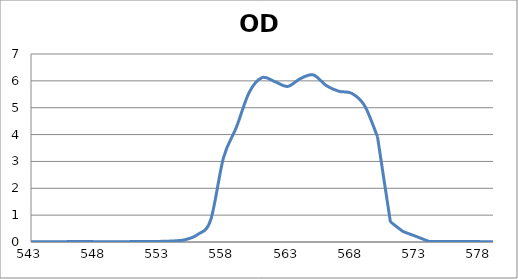
| Category | Series 0 |
|---|---|
| 2600.0 | 0.036 |
| 2599.0 | 0.035 |
| 2598.0 | 0.035 |
| 2597.0 | 0.034 |
| 2596.0 | 0.034 |
| 2595.0 | 0.033 |
| 2594.0 | 0.033 |
| 2593.0 | 0.032 |
| 2592.0 | 0.032 |
| 2591.0 | 0.032 |
| 2590.0 | 0.031 |
| 2589.0 | 0.031 |
| 2588.0 | 0.03 |
| 2587.0 | 0.03 |
| 2586.0 | 0.03 |
| 2585.0 | 0.03 |
| 2584.0 | 0.029 |
| 2583.0 | 0.029 |
| 2582.0 | 0.029 |
| 2581.0 | 0.029 |
| 2580.0 | 0.029 |
| 2579.0 | 0.028 |
| 2578.0 | 0.028 |
| 2577.0 | 0.028 |
| 2576.0 | 0.028 |
| 2575.0 | 0.028 |
| 2574.0 | 0.028 |
| 2573.0 | 0.028 |
| 2572.0 | 0.028 |
| 2571.0 | 0.028 |
| 2570.0 | 0.028 |
| 2569.0 | 0.028 |
| 2568.0 | 0.028 |
| 2567.0 | 0.028 |
| 2566.0 | 0.028 |
| 2565.0 | 0.028 |
| 2564.0 | 0.029 |
| 2563.0 | 0.029 |
| 2562.0 | 0.029 |
| 2561.0 | 0.029 |
| 2560.0 | 0.03 |
| 2559.0 | 0.03 |
| 2558.0 | 0.03 |
| 2557.0 | 0.031 |
| 2556.0 | 0.031 |
| 2555.0 | 0.032 |
| 2554.0 | 0.032 |
| 2553.0 | 0.033 |
| 2552.0 | 0.034 |
| 2551.0 | 0.034 |
| 2550.0 | 0.035 |
| 2549.0 | 0.036 |
| 2548.0 | 0.037 |
| 2547.0 | 0.038 |
| 2546.0 | 0.039 |
| 2545.0 | 0.04 |
| 2544.0 | 0.04 |
| 2543.0 | 0.041 |
| 2542.0 | 0.042 |
| 2541.0 | 0.042 |
| 2540.0 | 0.043 |
| 2539.0 | 0.044 |
| 2538.0 | 0.044 |
| 2537.0 | 0.045 |
| 2536.0 | 0.045 |
| 2535.0 | 0.046 |
| 2534.0 | 0.046 |
| 2533.0 | 0.046 |
| 2532.0 | 0.046 |
| 2531.0 | 0.046 |
| 2530.0 | 0.046 |
| 2529.0 | 0.046 |
| 2528.0 | 0.046 |
| 2527.0 | 0.046 |
| 2526.0 | 0.046 |
| 2525.0 | 0.045 |
| 2524.0 | 0.045 |
| 2523.0 | 0.044 |
| 2522.0 | 0.043 |
| 2521.0 | 0.043 |
| 2520.0 | 0.042 |
| 2519.0 | 0.041 |
| 2518.0 | 0.041 |
| 2517.0 | 0.04 |
| 2516.0 | 0.039 |
| 2515.0 | 0.038 |
| 2514.0 | 0.038 |
| 2513.0 | 0.037 |
| 2512.0 | 0.037 |
| 2511.0 | 0.036 |
| 2510.0 | 0.036 |
| 2509.0 | 0.036 |
| 2508.0 | 0.036 |
| 2507.0 | 0.036 |
| 2506.0 | 0.037 |
| 2505.0 | 0.037 |
| 2504.0 | 0.038 |
| 2503.0 | 0.039 |
| 2502.0 | 0.04 |
| 2501.0 | 0.041 |
| 2500.0 | 0.043 |
| 2499.0 | 0.045 |
| 2498.0 | 0.046 |
| 2497.0 | 0.048 |
| 2496.0 | 0.05 |
| 2495.0 | 0.052 |
| 2494.0 | 0.054 |
| 2493.0 | 0.057 |
| 2492.0 | 0.059 |
| 2491.0 | 0.062 |
| 2490.0 | 0.064 |
| 2489.0 | 0.066 |
| 2488.0 | 0.069 |
| 2487.0 | 0.071 |
| 2486.0 | 0.073 |
| 2485.0 | 0.076 |
| 2484.0 | 0.078 |
| 2483.0 | 0.079 |
| 2482.0 | 0.081 |
| 2481.0 | 0.083 |
| 2480.0 | 0.084 |
| 2479.0 | 0.085 |
| 2478.0 | 0.086 |
| 2477.0 | 0.087 |
| 2476.0 | 0.087 |
| 2475.0 | 0.087 |
| 2474.0 | 0.087 |
| 2473.0 | 0.087 |
| 2472.0 | 0.086 |
| 2471.0 | 0.085 |
| 2470.0 | 0.084 |
| 2469.0 | 0.083 |
| 2468.0 | 0.081 |
| 2467.0 | 0.08 |
| 2466.0 | 0.078 |
| 2465.0 | 0.075 |
| 2464.0 | 0.073 |
| 2463.0 | 0.071 |
| 2462.0 | 0.068 |
| 2461.0 | 0.066 |
| 2460.0 | 0.063 |
| 2459.0 | 0.061 |
| 2458.0 | 0.058 |
| 2457.0 | 0.056 |
| 2456.0 | 0.054 |
| 2455.0 | 0.052 |
| 2454.0 | 0.05 |
| 2453.0 | 0.048 |
| 2452.0 | 0.047 |
| 2451.0 | 0.045 |
| 2450.0 | 0.044 |
| 2449.0 | 0.044 |
| 2448.0 | 0.043 |
| 2447.0 | 0.043 |
| 2446.0 | 0.043 |
| 2445.0 | 0.043 |
| 2444.0 | 0.044 |
| 2443.0 | 0.045 |
| 2442.0 | 0.046 |
| 2441.0 | 0.047 |
| 2440.0 | 0.049 |
| 2439.0 | 0.051 |
| 2438.0 | 0.053 |
| 2437.0 | 0.055 |
| 2436.0 | 0.057 |
| 2435.0 | 0.059 |
| 2434.0 | 0.061 |
| 2433.0 | 0.063 |
| 2432.0 | 0.066 |
| 2431.0 | 0.068 |
| 2430.0 | 0.069 |
| 2429.0 | 0.071 |
| 2428.0 | 0.073 |
| 2427.0 | 0.074 |
| 2426.0 | 0.075 |
| 2425.0 | 0.076 |
| 2424.0 | 0.077 |
| 2423.0 | 0.077 |
| 2422.0 | 0.077 |
| 2421.0 | 0.077 |
| 2420.0 | 0.077 |
| 2419.0 | 0.076 |
| 2418.0 | 0.075 |
| 2417.0 | 0.074 |
| 2416.0 | 0.073 |
| 2415.0 | 0.071 |
| 2414.0 | 0.069 |
| 2413.0 | 0.068 |
| 2412.0 | 0.066 |
| 2411.0 | 0.064 |
| 2410.0 | 0.062 |
| 2409.0 | 0.06 |
| 2408.0 | 0.058 |
| 2407.0 | 0.056 |
| 2406.0 | 0.054 |
| 2405.0 | 0.053 |
| 2404.0 | 0.051 |
| 2403.0 | 0.05 |
| 2402.0 | 0.049 |
| 2401.0 | 0.048 |
| 2400.0 | 0.048 |
| 2399.0 | 0.048 |
| 2398.0 | 0.048 |
| 2397.0 | 0.048 |
| 2396.0 | 0.049 |
| 2395.0 | 0.05 |
| 2394.0 | 0.052 |
| 2393.0 | 0.053 |
| 2392.0 | 0.055 |
| 2391.0 | 0.057 |
| 2390.0 | 0.06 |
| 2389.0 | 0.063 |
| 2388.0 | 0.066 |
| 2387.0 | 0.068 |
| 2386.0 | 0.071 |
| 2385.0 | 0.074 |
| 2384.0 | 0.077 |
| 2383.0 | 0.079 |
| 2382.0 | 0.082 |
| 2381.0 | 0.084 |
| 2380.0 | 0.086 |
| 2379.0 | 0.088 |
| 2378.0 | 0.09 |
| 2377.0 | 0.091 |
| 2376.0 | 0.092 |
| 2375.0 | 0.093 |
| 2374.0 | 0.094 |
| 2373.0 | 0.094 |
| 2372.0 | 0.093 |
| 2371.0 | 0.093 |
| 2370.0 | 0.092 |
| 2369.0 | 0.091 |
| 2368.0 | 0.09 |
| 2367.0 | 0.088 |
| 2366.0 | 0.086 |
| 2365.0 | 0.084 |
| 2364.0 | 0.082 |
| 2363.0 | 0.08 |
| 2362.0 | 0.077 |
| 2361.0 | 0.075 |
| 2360.0 | 0.073 |
| 2359.0 | 0.07 |
| 2358.0 | 0.069 |
| 2357.0 | 0.067 |
| 2356.0 | 0.065 |
| 2355.0 | 0.063 |
| 2354.0 | 0.062 |
| 2353.0 | 0.062 |
| 2352.0 | 0.061 |
| 2351.0 | 0.062 |
| 2350.0 | 0.063 |
| 2349.0 | 0.064 |
| 2348.0 | 0.065 |
| 2347.0 | 0.067 |
| 2346.0 | 0.069 |
| 2345.0 | 0.071 |
| 2344.0 | 0.074 |
| 2343.0 | 0.077 |
| 2342.0 | 0.081 |
| 2341.0 | 0.084 |
| 2340.0 | 0.088 |
| 2339.0 | 0.091 |
| 2338.0 | 0.095 |
| 2337.0 | 0.098 |
| 2336.0 | 0.102 |
| 2335.0 | 0.105 |
| 2334.0 | 0.108 |
| 2333.0 | 0.111 |
| 2332.0 | 0.113 |
| 2331.0 | 0.115 |
| 2330.0 | 0.117 |
| 2329.0 | 0.118 |
| 2328.0 | 0.119 |
| 2327.0 | 0.12 |
| 2326.0 | 0.12 |
| 2325.0 | 0.12 |
| 2324.0 | 0.119 |
| 2323.0 | 0.118 |
| 2322.0 | 0.117 |
| 2321.0 | 0.116 |
| 2320.0 | 0.114 |
| 2319.0 | 0.111 |
| 2318.0 | 0.109 |
| 2317.0 | 0.106 |
| 2316.0 | 0.103 |
| 2315.0 | 0.101 |
| 2314.0 | 0.098 |
| 2313.0 | 0.095 |
| 2312.0 | 0.093 |
| 2311.0 | 0.091 |
| 2310.0 | 0.089 |
| 2309.0 | 0.088 |
| 2308.0 | 0.087 |
| 2307.0 | 0.086 |
| 2306.0 | 0.086 |
| 2305.0 | 0.087 |
| 2304.0 | 0.088 |
| 2303.0 | 0.09 |
| 2302.0 | 0.092 |
| 2301.0 | 0.095 |
| 2300.0 | 0.098 |
| 2299.0 | 0.101 |
| 2298.0 | 0.105 |
| 2297.0 | 0.109 |
| 2296.0 | 0.114 |
| 2295.0 | 0.118 |
| 2294.0 | 0.123 |
| 2293.0 | 0.127 |
| 2292.0 | 0.132 |
| 2291.0 | 0.136 |
| 2290.0 | 0.14 |
| 2289.0 | 0.144 |
| 2288.0 | 0.147 |
| 2287.0 | 0.151 |
| 2286.0 | 0.153 |
| 2285.0 | 0.155 |
| 2284.0 | 0.157 |
| 2283.0 | 0.158 |
| 2282.0 | 0.158 |
| 2281.0 | 0.158 |
| 2280.0 | 0.157 |
| 2279.0 | 0.155 |
| 2278.0 | 0.153 |
| 2277.0 | 0.15 |
| 2276.0 | 0.146 |
| 2275.0 | 0.141 |
| 2274.0 | 0.136 |
| 2273.0 | 0.131 |
| 2272.0 | 0.125 |
| 2271.0 | 0.119 |
| 2270.0 | 0.112 |
| 2269.0 | 0.106 |
| 2268.0 | 0.099 |
| 2267.0 | 0.093 |
| 2266.0 | 0.087 |
| 2265.0 | 0.08 |
| 2264.0 | 0.075 |
| 2263.0 | 0.07 |
| 2262.0 | 0.065 |
| 2261.0 | 0.062 |
| 2260.0 | 0.059 |
| 2259.0 | 0.057 |
| 2258.0 | 0.056 |
| 2257.0 | 0.056 |
| 2256.0 | 0.057 |
| 2255.0 | 0.058 |
| 2254.0 | 0.061 |
| 2253.0 | 0.064 |
| 2252.0 | 0.068 |
| 2251.0 | 0.073 |
| 2250.0 | 0.078 |
| 2249.0 | 0.083 |
| 2248.0 | 0.089 |
| 2247.0 | 0.095 |
| 2246.0 | 0.101 |
| 2245.0 | 0.107 |
| 2244.0 | 0.112 |
| 2243.0 | 0.118 |
| 2242.0 | 0.124 |
| 2241.0 | 0.128 |
| 2240.0 | 0.133 |
| 2239.0 | 0.137 |
| 2238.0 | 0.14 |
| 2237.0 | 0.143 |
| 2236.0 | 0.144 |
| 2235.0 | 0.145 |
| 2234.0 | 0.146 |
| 2233.0 | 0.145 |
| 2232.0 | 0.144 |
| 2231.0 | 0.142 |
| 2230.0 | 0.14 |
| 2229.0 | 0.137 |
| 2228.0 | 0.134 |
| 2227.0 | 0.13 |
| 2226.0 | 0.125 |
| 2225.0 | 0.121 |
| 2224.0 | 0.116 |
| 2223.0 | 0.111 |
| 2222.0 | 0.107 |
| 2221.0 | 0.102 |
| 2220.0 | 0.098 |
| 2219.0 | 0.094 |
| 2218.0 | 0.091 |
| 2217.0 | 0.088 |
| 2216.0 | 0.086 |
| 2215.0 | 0.084 |
| 2214.0 | 0.083 |
| 2213.0 | 0.083 |
| 2212.0 | 0.083 |
| 2211.0 | 0.084 |
| 2210.0 | 0.086 |
| 2209.0 | 0.088 |
| 2208.0 | 0.091 |
| 2207.0 | 0.094 |
| 2206.0 | 0.098 |
| 2205.0 | 0.102 |
| 2204.0 | 0.105 |
| 2203.0 | 0.109 |
| 2202.0 | 0.113 |
| 2201.0 | 0.117 |
| 2200.0 | 0.121 |
| 2199.0 | 0.124 |
| 2198.0 | 0.127 |
| 2197.0 | 0.129 |
| 2196.0 | 0.13 |
| 2195.0 | 0.131 |
| 2194.0 | 0.132 |
| 2193.0 | 0.131 |
| 2192.0 | 0.13 |
| 2191.0 | 0.129 |
| 2190.0 | 0.126 |
| 2189.0 | 0.124 |
| 2188.0 | 0.12 |
| 2187.0 | 0.116 |
| 2186.0 | 0.111 |
| 2185.0 | 0.107 |
| 2184.0 | 0.102 |
| 2183.0 | 0.097 |
| 2182.0 | 0.092 |
| 2181.0 | 0.087 |
| 2180.0 | 0.082 |
| 2179.0 | 0.078 |
| 2178.0 | 0.074 |
| 2177.0 | 0.071 |
| 2176.0 | 0.069 |
| 2175.0 | 0.067 |
| 2174.0 | 0.066 |
| 2173.0 | 0.066 |
| 2172.0 | 0.067 |
| 2171.0 | 0.068 |
| 2170.0 | 0.07 |
| 2169.0 | 0.073 |
| 2168.0 | 0.077 |
| 2167.0 | 0.081 |
| 2166.0 | 0.085 |
| 2165.0 | 0.09 |
| 2164.0 | 0.095 |
| 2163.0 | 0.101 |
| 2162.0 | 0.106 |
| 2161.0 | 0.111 |
| 2160.0 | 0.115 |
| 2159.0 | 0.12 |
| 2158.0 | 0.124 |
| 2157.0 | 0.127 |
| 2156.0 | 0.129 |
| 2155.0 | 0.131 |
| 2154.0 | 0.132 |
| 2153.0 | 0.132 |
| 2152.0 | 0.131 |
| 2151.0 | 0.129 |
| 2150.0 | 0.126 |
| 2149.0 | 0.123 |
| 2148.0 | 0.119 |
| 2147.0 | 0.114 |
| 2146.0 | 0.109 |
| 2145.0 | 0.103 |
| 2144.0 | 0.097 |
| 2143.0 | 0.091 |
| 2142.0 | 0.085 |
| 2141.0 | 0.079 |
| 2140.0 | 0.074 |
| 2139.0 | 0.069 |
| 2138.0 | 0.065 |
| 2137.0 | 0.061 |
| 2136.0 | 0.059 |
| 2135.0 | 0.057 |
| 2134.0 | 0.057 |
| 2133.0 | 0.058 |
| 2132.0 | 0.06 |
| 2131.0 | 0.064 |
| 2130.0 | 0.068 |
| 2129.0 | 0.074 |
| 2128.0 | 0.081 |
| 2127.0 | 0.088 |
| 2126.0 | 0.096 |
| 2125.0 | 0.105 |
| 2124.0 | 0.114 |
| 2123.0 | 0.123 |
| 2122.0 | 0.133 |
| 2121.0 | 0.142 |
| 2120.0 | 0.151 |
| 2119.0 | 0.159 |
| 2118.0 | 0.167 |
| 2117.0 | 0.174 |
| 2116.0 | 0.181 |
| 2115.0 | 0.186 |
| 2114.0 | 0.191 |
| 2113.0 | 0.195 |
| 2112.0 | 0.198 |
| 2111.0 | 0.2 |
| 2110.0 | 0.201 |
| 2109.0 | 0.2 |
| 2108.0 | 0.2 |
| 2107.0 | 0.198 |
| 2106.0 | 0.196 |
| 2105.0 | 0.193 |
| 2104.0 | 0.19 |
| 2103.0 | 0.187 |
| 2102.0 | 0.184 |
| 2101.0 | 0.18 |
| 2100.0 | 0.176 |
| 2099.0 | 0.173 |
| 2098.0 | 0.17 |
| 2097.0 | 0.167 |
| 2096.0 | 0.165 |
| 2095.0 | 0.164 |
| 2094.0 | 0.163 |
| 2093.0 | 0.163 |
| 2092.0 | 0.164 |
| 2091.0 | 0.165 |
| 2090.0 | 0.167 |
| 2089.0 | 0.169 |
| 2088.0 | 0.173 |
| 2087.0 | 0.176 |
| 2086.0 | 0.18 |
| 2085.0 | 0.184 |
| 2084.0 | 0.188 |
| 2083.0 | 0.192 |
| 2082.0 | 0.196 |
| 2081.0 | 0.2 |
| 2080.0 | 0.203 |
| 2079.0 | 0.206 |
| 2078.0 | 0.208 |
| 2077.0 | 0.21 |
| 2076.0 | 0.211 |
| 2075.0 | 0.21 |
| 2074.0 | 0.209 |
| 2073.0 | 0.207 |
| 2072.0 | 0.205 |
| 2071.0 | 0.201 |
| 2070.0 | 0.197 |
| 2069.0 | 0.191 |
| 2068.0 | 0.186 |
| 2067.0 | 0.18 |
| 2066.0 | 0.173 |
| 2065.0 | 0.165 |
| 2064.0 | 0.158 |
| 2063.0 | 0.151 |
| 2062.0 | 0.144 |
| 2061.0 | 0.137 |
| 2060.0 | 0.13 |
| 2059.0 | 0.124 |
| 2058.0 | 0.119 |
| 2057.0 | 0.115 |
| 2056.0 | 0.111 |
| 2055.0 | 0.109 |
| 2054.0 | 0.108 |
| 2053.0 | 0.107 |
| 2052.0 | 0.108 |
| 2051.0 | 0.109 |
| 2050.0 | 0.111 |
| 2049.0 | 0.114 |
| 2048.0 | 0.118 |
| 2047.0 | 0.122 |
| 2046.0 | 0.126 |
| 2045.0 | 0.131 |
| 2044.0 | 0.136 |
| 2043.0 | 0.14 |
| 2042.0 | 0.145 |
| 2041.0 | 0.149 |
| 2040.0 | 0.153 |
| 2039.0 | 0.156 |
| 2038.0 | 0.159 |
| 2037.0 | 0.161 |
| 2036.0 | 0.162 |
| 2035.0 | 0.163 |
| 2034.0 | 0.163 |
| 2033.0 | 0.162 |
| 2032.0 | 0.16 |
| 2031.0 | 0.158 |
| 2030.0 | 0.155 |
| 2029.0 | 0.151 |
| 2028.0 | 0.147 |
| 2027.0 | 0.143 |
| 2026.0 | 0.138 |
| 2025.0 | 0.133 |
| 2024.0 | 0.128 |
| 2023.0 | 0.122 |
| 2022.0 | 0.117 |
| 2021.0 | 0.111 |
| 2020.0 | 0.106 |
| 2019.0 | 0.101 |
| 2018.0 | 0.096 |
| 2017.0 | 0.091 |
| 2016.0 | 0.086 |
| 2015.0 | 0.081 |
| 2014.0 | 0.077 |
| 2013.0 | 0.072 |
| 2012.0 | 0.068 |
| 2011.0 | 0.064 |
| 2010.0 | 0.06 |
| 2009.0 | 0.056 |
| 2008.0 | 0.052 |
| 2007.0 | 0.048 |
| 2006.0 | 0.044 |
| 2005.0 | 0.041 |
| 2004.0 | 0.038 |
| 2003.0 | 0.035 |
| 2002.0 | 0.032 |
| 2001.0 | 0.03 |
| 2000.0 | 0.028 |
| 1999.0 | 0.027 |
| 1998.0 | 0.027 |
| 1997.0 | 0.028 |
| 1996.0 | 0.029 |
| 1995.0 | 0.032 |
| 1994.0 | 0.035 |
| 1993.0 | 0.04 |
| 1992.0 | 0.045 |
| 1991.0 | 0.052 |
| 1990.0 | 0.059 |
| 1989.0 | 0.067 |
| 1988.0 | 0.076 |
| 1987.0 | 0.085 |
| 1986.0 | 0.094 |
| 1985.0 | 0.103 |
| 1984.0 | 0.113 |
| 1983.0 | 0.122 |
| 1982.0 | 0.13 |
| 1981.0 | 0.138 |
| 1980.0 | 0.145 |
| 1979.0 | 0.151 |
| 1978.0 | 0.156 |
| 1977.0 | 0.16 |
| 1976.0 | 0.163 |
| 1975.0 | 0.165 |
| 1974.0 | 0.165 |
| 1973.0 | 0.165 |
| 1972.0 | 0.163 |
| 1971.0 | 0.159 |
| 1970.0 | 0.155 |
| 1969.0 | 0.149 |
| 1968.0 | 0.142 |
| 1967.0 | 0.134 |
| 1966.0 | 0.125 |
| 1965.0 | 0.116 |
| 1964.0 | 0.107 |
| 1963.0 | 0.096 |
| 1962.0 | 0.086 |
| 1961.0 | 0.076 |
| 1960.0 | 0.066 |
| 1959.0 | 0.057 |
| 1958.0 | 0.049 |
| 1957.0 | 0.043 |
| 1956.0 | 0.038 |
| 1955.0 | 0.035 |
| 1954.0 | 0.034 |
| 1953.0 | 0.034 |
| 1952.0 | 0.036 |
| 1951.0 | 0.039 |
| 1950.0 | 0.044 |
| 1949.0 | 0.05 |
| 1948.0 | 0.056 |
| 1947.0 | 0.063 |
| 1946.0 | 0.071 |
| 1945.0 | 0.078 |
| 1944.0 | 0.085 |
| 1943.0 | 0.092 |
| 1942.0 | 0.098 |
| 1941.0 | 0.103 |
| 1940.0 | 0.107 |
| 1939.0 | 0.11 |
| 1938.0 | 0.112 |
| 1937.0 | 0.114 |
| 1936.0 | 0.114 |
| 1935.0 | 0.113 |
| 1934.0 | 0.111 |
| 1933.0 | 0.108 |
| 1932.0 | 0.105 |
| 1931.0 | 0.101 |
| 1930.0 | 0.096 |
| 1929.0 | 0.091 |
| 1928.0 | 0.086 |
| 1927.0 | 0.081 |
| 1926.0 | 0.076 |
| 1925.0 | 0.071 |
| 1924.0 | 0.067 |
| 1923.0 | 0.063 |
| 1922.0 | 0.06 |
| 1921.0 | 0.058 |
| 1920.0 | 0.056 |
| 1919.0 | 0.055 |
| 1918.0 | 0.055 |
| 1917.0 | 0.055 |
| 1916.0 | 0.055 |
| 1915.0 | 0.057 |
| 1914.0 | 0.058 |
| 1913.0 | 0.061 |
| 1912.0 | 0.062 |
| 1911.0 | 0.064 |
| 1910.0 | 0.065 |
| 1909.0 | 0.066 |
| 1908.0 | 0.067 |
| 1907.0 | 0.067 |
| 1906.0 | 0.068 |
| 1905.0 | 0.068 |
| 1904.0 | 0.068 |
| 1903.0 | 0.067 |
| 1902.0 | 0.067 |
| 1901.0 | 0.066 |
| 1900.0 | 0.066 |
| 1899.0 | 0.066 |
| 1898.0 | 0.066 |
| 1897.0 | 0.066 |
| 1896.0 | 0.067 |
| 1895.0 | 0.069 |
| 1894.0 | 0.071 |
| 1893.0 | 0.074 |
| 1892.0 | 0.077 |
| 1891.0 | 0.081 |
| 1890.0 | 0.086 |
| 1889.0 | 0.09 |
| 1888.0 | 0.094 |
| 1887.0 | 0.099 |
| 1886.0 | 0.103 |
| 1885.0 | 0.107 |
| 1884.0 | 0.111 |
| 1883.0 | 0.114 |
| 1882.0 | 0.117 |
| 1881.0 | 0.119 |
| 1880.0 | 0.12 |
| 1879.0 | 0.12 |
| 1878.0 | 0.119 |
| 1877.0 | 0.117 |
| 1876.0 | 0.115 |
| 1875.0 | 0.112 |
| 1874.0 | 0.109 |
| 1873.0 | 0.104 |
| 1872.0 | 0.1 |
| 1871.0 | 0.096 |
| 1870.0 | 0.092 |
| 1869.0 | 0.089 |
| 1868.0 | 0.086 |
| 1867.0 | 0.085 |
| 1866.0 | 0.084 |
| 1865.0 | 0.084 |
| 1864.0 | 0.086 |
| 1863.0 | 0.089 |
| 1862.0 | 0.092 |
| 1861.0 | 0.098 |
| 1860.0 | 0.105 |
| 1859.0 | 0.112 |
| 1858.0 | 0.119 |
| 1857.0 | 0.125 |
| 1856.0 | 0.131 |
| 1855.0 | 0.138 |
| 1854.0 | 0.144 |
| 1853.0 | 0.149 |
| 1852.0 | 0.154 |
| 1851.0 | 0.156 |
| 1850.0 | 0.158 |
| 1849.0 | 0.158 |
| 1848.0 | 0.157 |
| 1847.0 | 0.155 |
| 1846.0 | 0.152 |
| 1845.0 | 0.149 |
| 1844.0 | 0.143 |
| 1843.0 | 0.136 |
| 1842.0 | 0.126 |
| 1841.0 | 0.118 |
| 1840.0 | 0.109 |
| 1839.0 | 0.101 |
| 1838.0 | 0.093 |
| 1837.0 | 0.084 |
| 1836.0 | 0.076 |
| 1835.0 | 0.07 |
| 1834.0 | 0.065 |
| 1833.0 | 0.062 |
| 1832.0 | 0.06 |
| 1831.0 | 0.06 |
| 1830.0 | 0.061 |
| 1829.0 | 0.063 |
| 1828.0 | 0.066 |
| 1827.0 | 0.071 |
| 1826.0 | 0.076 |
| 1825.0 | 0.08 |
| 1824.0 | 0.084 |
| 1823.0 | 0.087 |
| 1822.0 | 0.091 |
| 1821.0 | 0.094 |
| 1820.0 | 0.097 |
| 1819.0 | 0.098 |
| 1818.0 | 0.098 |
| 1817.0 | 0.097 |
| 1816.0 | 0.094 |
| 1815.0 | 0.092 |
| 1814.0 | 0.088 |
| 1813.0 | 0.085 |
| 1812.0 | 0.081 |
| 1811.0 | 0.076 |
| 1810.0 | 0.072 |
| 1809.0 | 0.069 |
| 1808.0 | 0.066 |
| 1807.0 | 0.064 |
| 1806.0 | 0.063 |
| 1805.0 | 0.063 |
| 1804.0 | 0.063 |
| 1803.0 | 0.065 |
| 1802.0 | 0.068 |
| 1801.0 | 0.072 |
| 1800.0 | 0.077 |
| 1799.0 | 0.082 |
| 1798.0 | 0.088 |
| 1797.0 | 0.093 |
| 1796.0 | 0.098 |
| 1795.0 | 0.103 |
| 1794.0 | 0.107 |
| 1793.0 | 0.111 |
| 1792.0 | 0.113 |
| 1791.0 | 0.114 |
| 1790.0 | 0.115 |
| 1789.0 | 0.115 |
| 1788.0 | 0.114 |
| 1787.0 | 0.112 |
| 1786.0 | 0.11 |
| 1785.0 | 0.107 |
| 1784.0 | 0.105 |
| 1783.0 | 0.103 |
| 1782.0 | 0.101 |
| 1781.0 | 0.099 |
| 1780.0 | 0.098 |
| 1779.0 | 0.098 |
| 1778.0 | 0.099 |
| 1777.0 | 0.101 |
| 1776.0 | 0.103 |
| 1775.0 | 0.106 |
| 1774.0 | 0.11 |
| 1773.0 | 0.113 |
| 1772.0 | 0.117 |
| 1771.0 | 0.121 |
| 1770.0 | 0.124 |
| 1769.0 | 0.128 |
| 1768.0 | 0.13 |
| 1767.0 | 0.132 |
| 1766.0 | 0.134 |
| 1765.0 | 0.134 |
| 1764.0 | 0.133 |
| 1763.0 | 0.131 |
| 1762.0 | 0.129 |
| 1761.0 | 0.126 |
| 1760.0 | 0.123 |
| 1759.0 | 0.119 |
| 1758.0 | 0.115 |
| 1757.0 | 0.111 |
| 1756.0 | 0.108 |
| 1755.0 | 0.105 |
| 1754.0 | 0.103 |
| 1753.0 | 0.102 |
| 1752.0 | 0.102 |
| 1751.0 | 0.103 |
| 1750.0 | 0.105 |
| 1749.0 | 0.107 |
| 1748.0 | 0.11 |
| 1747.0 | 0.114 |
| 1746.0 | 0.117 |
| 1745.0 | 0.121 |
| 1744.0 | 0.124 |
| 1743.0 | 0.126 |
| 1742.0 | 0.128 |
| 1741.0 | 0.129 |
| 1740.0 | 0.129 |
| 1739.0 | 0.128 |
| 1738.0 | 0.125 |
| 1737.0 | 0.122 |
| 1736.0 | 0.119 |
| 1735.0 | 0.114 |
| 1734.0 | 0.109 |
| 1733.0 | 0.104 |
| 1732.0 | 0.099 |
| 1731.0 | 0.094 |
| 1730.0 | 0.09 |
| 1729.0 | 0.086 |
| 1728.0 | 0.084 |
| 1727.0 | 0.083 |
| 1726.0 | 0.083 |
| 1725.0 | 0.084 |
| 1724.0 | 0.086 |
| 1723.0 | 0.089 |
| 1722.0 | 0.093 |
| 1721.0 | 0.098 |
| 1720.0 | 0.103 |
| 1719.0 | 0.108 |
| 1718.0 | 0.113 |
| 1717.0 | 0.117 |
| 1716.0 | 0.12 |
| 1715.0 | 0.123 |
| 1714.0 | 0.124 |
| 1713.0 | 0.124 |
| 1712.0 | 0.123 |
| 1711.0 | 0.122 |
| 1710.0 | 0.119 |
| 1709.0 | 0.116 |
| 1708.0 | 0.113 |
| 1707.0 | 0.109 |
| 1706.0 | 0.106 |
| 1705.0 | 0.103 |
| 1704.0 | 0.1 |
| 1703.0 | 0.099 |
| 1702.0 | 0.098 |
| 1701.0 | 0.099 |
| 1700.0 | 0.1 |
| 1699.0 | 0.103 |
| 1698.0 | 0.105 |
| 1697.0 | 0.109 |
| 1696.0 | 0.113 |
| 1695.0 | 0.116 |
| 1694.0 | 0.12 |
| 1693.0 | 0.123 |
| 1692.0 | 0.126 |
| 1691.0 | 0.128 |
| 1690.0 | 0.129 |
| 1689.0 | 0.13 |
| 1688.0 | 0.129 |
| 1687.0 | 0.128 |
| 1686.0 | 0.126 |
| 1685.0 | 0.124 |
| 1684.0 | 0.122 |
| 1683.0 | 0.12 |
| 1682.0 | 0.118 |
| 1681.0 | 0.116 |
| 1680.0 | 0.115 |
| 1679.0 | 0.115 |
| 1678.0 | 0.116 |
| 1677.0 | 0.118 |
| 1676.0 | 0.121 |
| 1675.0 | 0.125 |
| 1674.0 | 0.129 |
| 1673.0 | 0.133 |
| 1672.0 | 0.138 |
| 1671.0 | 0.142 |
| 1670.0 | 0.145 |
| 1669.0 | 0.148 |
| 1668.0 | 0.15 |
| 1667.0 | 0.15 |
| 1666.0 | 0.15 |
| 1665.0 | 0.149 |
| 1664.0 | 0.147 |
| 1663.0 | 0.144 |
| 1662.0 | 0.141 |
| 1661.0 | 0.138 |
| 1660.0 | 0.135 |
| 1659.0 | 0.133 |
| 1658.0 | 0.131 |
| 1657.0 | 0.131 |
| 1656.0 | 0.132 |
| 1655.0 | 0.135 |
| 1654.0 | 0.138 |
| 1653.0 | 0.143 |
| 1652.0 | 0.149 |
| 1651.0 | 0.156 |
| 1650.0 | 0.163 |
| 1649.0 | 0.171 |
| 1648.0 | 0.178 |
| 1647.0 | 0.184 |
| 1646.0 | 0.19 |
| 1645.0 | 0.194 |
| 1644.0 | 0.197 |
| 1643.0 | 0.199 |
| 1642.0 | 0.198 |
| 1641.0 | 0.196 |
| 1640.0 | 0.192 |
| 1639.0 | 0.187 |
| 1638.0 | 0.18 |
| 1637.0 | 0.173 |
| 1636.0 | 0.165 |
| 1635.0 | 0.156 |
| 1634.0 | 0.148 |
| 1633.0 | 0.14 |
| 1632.0 | 0.133 |
| 1631.0 | 0.128 |
| 1630.0 | 0.124 |
| 1629.0 | 0.121 |
| 1628.0 | 0.12 |
| 1627.0 | 0.12 |
| 1626.0 | 0.121 |
| 1625.0 | 0.123 |
| 1624.0 | 0.125 |
| 1623.0 | 0.128 |
| 1622.0 | 0.13 |
| 1621.0 | 0.131 |
| 1620.0 | 0.133 |
| 1619.0 | 0.133 |
| 1618.0 | 0.133 |
| 1617.0 | 0.132 |
| 1616.0 | 0.13 |
| 1615.0 | 0.128 |
| 1614.0 | 0.126 |
| 1613.0 | 0.124 |
| 1612.0 | 0.123 |
| 1611.0 | 0.121 |
| 1610.0 | 0.12 |
| 1609.0 | 0.119 |
| 1608.0 | 0.119 |
| 1607.0 | 0.12 |
| 1606.0 | 0.121 |
| 1605.0 | 0.122 |
| 1604.0 | 0.123 |
| 1603.0 | 0.125 |
| 1602.0 | 0.126 |
| 1601.0 | 0.127 |
| 1600.0 | 0.127 |
| 1599.0 | 0.127 |
| 1598.0 | 0.127 |
| 1597.0 | 0.127 |
| 1596.0 | 0.126 |
| 1595.0 | 0.126 |
| 1594.0 | 0.126 |
| 1593.0 | 0.127 |
| 1592.0 | 0.128 |
| 1591.0 | 0.131 |
| 1590.0 | 0.135 |
| 1589.0 | 0.14 |
| 1588.0 | 0.145 |
| 1587.0 | 0.152 |
| 1586.0 | 0.159 |
| 1585.0 | 0.166 |
| 1584.0 | 0.172 |
| 1583.0 | 0.177 |
| 1582.0 | 0.182 |
| 1581.0 | 0.185 |
| 1580.0 | 0.187 |
| 1579.0 | 0.187 |
| 1578.0 | 0.185 |
| 1577.0 | 0.182 |
| 1576.0 | 0.178 |
| 1575.0 | 0.172 |
| 1574.0 | 0.166 |
| 1573.0 | 0.16 |
| 1572.0 | 0.154 |
| 1571.0 | 0.148 |
| 1570.0 | 0.144 |
| 1569.0 | 0.141 |
| 1568.0 | 0.14 |
| 1567.0 | 0.141 |
| 1566.0 | 0.144 |
| 1565.0 | 0.148 |
| 1564.0 | 0.154 |
| 1563.0 | 0.161 |
| 1562.0 | 0.168 |
| 1561.0 | 0.175 |
| 1560.0 | 0.181 |
| 1559.0 | 0.186 |
| 1558.0 | 0.189 |
| 1557.0 | 0.191 |
| 1556.0 | 0.192 |
| 1555.0 | 0.19 |
| 1554.0 | 0.188 |
| 1553.0 | 0.185 |
| 1552.0 | 0.181 |
| 1551.0 | 0.177 |
| 1550.0 | 0.173 |
| 1549.0 | 0.17 |
| 1548.0 | 0.169 |
| 1547.0 | 0.169 |
| 1546.0 | 0.17 |
| 1545.0 | 0.172 |
| 1544.0 | 0.176 |
| 1543.0 | 0.18 |
| 1542.0 | 0.184 |
| 1541.0 | 0.188 |
| 1540.0 | 0.191 |
| 1539.0 | 0.193 |
| 1538.0 | 0.194 |
| 1537.0 | 0.194 |
| 1536.0 | 0.192 |
| 1535.0 | 0.189 |
| 1534.0 | 0.184 |
| 1533.0 | 0.178 |
| 1532.0 | 0.172 |
| 1531.0 | 0.166 |
| 1530.0 | 0.16 |
| 1529.0 | 0.155 |
| 1528.0 | 0.151 |
| 1527.0 | 0.149 |
| 1526.0 | 0.148 |
| 1525.0 | 0.149 |
| 1524.0 | 0.151 |
| 1523.0 | 0.154 |
| 1522.0 | 0.158 |
| 1521.0 | 0.162 |
| 1520.0 | 0.166 |
| 1519.0 | 0.168 |
| 1518.0 | 0.17 |
| 1517.0 | 0.171 |
| 1516.0 | 0.171 |
| 1515.0 | 0.169 |
| 1514.0 | 0.166 |
| 1513.0 | 0.163 |
| 1512.0 | 0.16 |
| 1511.0 | 0.157 |
| 1510.0 | 0.154 |
| 1509.0 | 0.153 |
| 1508.0 | 0.153 |
| 1507.0 | 0.154 |
| 1506.0 | 0.156 |
| 1505.0 | 0.159 |
| 1504.0 | 0.162 |
| 1503.0 | 0.165 |
| 1502.0 | 0.169 |
| 1501.0 | 0.171 |
| 1500.0 | 0.173 |
| 1499.0 | 0.173 |
| 1498.0 | 0.174 |
| 1497.0 | 0.173 |
| 1496.0 | 0.173 |
| 1495.0 | 0.172 |
| 1494.0 | 0.172 |
| 1493.0 | 0.174 |
| 1492.0 | 0.176 |
| 1491.0 | 0.18 |
| 1490.0 | 0.186 |
| 1489.0 | 0.194 |
| 1488.0 | 0.202 |
| 1487.0 | 0.211 |
| 1486.0 | 0.22 |
| 1485.0 | 0.229 |
| 1484.0 | 0.236 |
| 1483.0 | 0.241 |
| 1482.0 | 0.244 |
| 1481.0 | 0.244 |
| 1480.0 | 0.242 |
| 1479.0 | 0.238 |
| 1478.0 | 0.233 |
| 1477.0 | 0.226 |
| 1476.0 | 0.22 |
| 1475.0 | 0.216 |
| 1474.0 | 0.214 |
| 1473.0 | 0.216 |
| 1472.0 | 0.221 |
| 1471.0 | 0.231 |
| 1470.0 | 0.244 |
| 1469.0 | 0.259 |
| 1468.0 | 0.276 |
| 1467.0 | 0.292 |
| 1466.0 | 0.307 |
| 1465.0 | 0.321 |
| 1464.0 | 0.332 |
| 1463.0 | 0.338 |
| 1462.0 | 0.342 |
| 1461.0 | 0.341 |
| 1460.0 | 0.337 |
| 1459.0 | 0.33 |
| 1458.0 | 0.32 |
| 1457.0 | 0.309 |
| 1456.0 | 0.298 |
| 1455.0 | 0.287 |
| 1454.0 | 0.279 |
| 1453.0 | 0.274 |
| 1452.0 | 0.273 |
| 1451.0 | 0.274 |
| 1450.0 | 0.28 |
| 1449.0 | 0.288 |
| 1448.0 | 0.298 |
| 1447.0 | 0.308 |
| 1446.0 | 0.316 |
| 1445.0 | 0.324 |
| 1444.0 | 0.329 |
| 1443.0 | 0.329 |
| 1442.0 | 0.326 |
| 1441.0 | 0.319 |
| 1440.0 | 0.309 |
| 1439.0 | 0.296 |
| 1438.0 | 0.282 |
| 1437.0 | 0.269 |
| 1436.0 | 0.258 |
| 1435.0 | 0.249 |
| 1434.0 | 0.245 |
| 1433.0 | 0.245 |
| 1432.0 | 0.25 |
| 1431.0 | 0.258 |
| 1430.0 | 0.268 |
| 1429.0 | 0.278 |
| 1428.0 | 0.287 |
| 1427.0 | 0.295 |
| 1426.0 | 0.299 |
| 1425.0 | 0.299 |
| 1424.0 | 0.295 |
| 1423.0 | 0.287 |
| 1422.0 | 0.277 |
| 1421.0 | 0.264 |
| 1420.0 | 0.249 |
| 1419.0 | 0.235 |
| 1418.0 | 0.223 |
| 1417.0 | 0.215 |
| 1416.0 | 0.209 |
| 1415.0 | 0.207 |
| 1414.0 | 0.21 |
| 1413.0 | 0.217 |
| 1412.0 | 0.224 |
| 1411.0 | 0.232 |
| 1410.0 | 0.239 |
| 1409.0 | 0.245 |
| 1408.0 | 0.249 |
| 1407.0 | 0.25 |
| 1406.0 | 0.248 |
| 1405.0 | 0.242 |
| 1404.0 | 0.234 |
| 1403.0 | 0.225 |
| 1402.0 | 0.217 |
| 1401.0 | 0.208 |
| 1400.0 | 0.202 |
| 1399.0 | 0.202 |
| 1398.0 | 0.202 |
| 1397.0 | 0.205 |
| 1396.0 | 0.211 |
| 1395.0 | 0.22 |
| 1394.0 | 0.227 |
| 1393.0 | 0.233 |
| 1392.0 | 0.237 |
| 1391.0 | 0.238 |
| 1390.0 | 0.237 |
| 1389.0 | 0.232 |
| 1388.0 | 0.227 |
| 1387.0 | 0.222 |
| 1386.0 | 0.218 |
| 1385.0 | 0.216 |
| 1384.0 | 0.216 |
| 1383.0 | 0.222 |
| 1382.0 | 0.231 |
| 1381.0 | 0.244 |
| 1380.0 | 0.257 |
| 1379.0 | 0.269 |
| 1378.0 | 0.281 |
| 1377.0 | 0.29 |
| 1376.0 | 0.297 |
| 1375.0 | 0.3 |
| 1374.0 | 0.3 |
| 1373.0 | 0.296 |
| 1372.0 | 0.288 |
| 1371.0 | 0.278 |
| 1370.0 | 0.266 |
| 1369.0 | 0.256 |
| 1368.0 | 0.246 |
| 1367.0 | 0.239 |
| 1366.0 | 0.236 |
| 1365.0 | 0.238 |
| 1364.0 | 0.242 |
| 1363.0 | 0.25 |
| 1362.0 | 0.261 |
| 1361.0 | 0.273 |
| 1360.0 | 0.282 |
| 1359.0 | 0.289 |
| 1358.0 | 0.292 |
| 1357.0 | 0.291 |
| 1356.0 | 0.286 |
| 1355.0 | 0.279 |
| 1354.0 | 0.27 |
| 1353.0 | 0.259 |
| 1352.0 | 0.247 |
| 1351.0 | 0.235 |
| 1350.0 | 0.225 |
| 1349.0 | 0.217 |
| 1348.0 | 0.212 |
| 1347.0 | 0.209 |
| 1346.0 | 0.208 |
| 1345.0 | 0.208 |
| 1344.0 | 0.207 |
| 1343.0 | 0.207 |
| 1342.0 | 0.206 |
| 1341.0 | 0.205 |
| 1340.0 | 0.203 |
| 1339.0 | 0.201 |
| 1338.0 | 0.2 |
| 1337.0 | 0.199 |
| 1336.0 | 0.199 |
| 1335.0 | 0.2 |
| 1334.0 | 0.201 |
| 1333.0 | 0.204 |
| 1332.0 | 0.206 |
| 1331.0 | 0.208 |
| 1330.0 | 0.208 |
| 1329.0 | 0.208 |
| 1328.0 | 0.207 |
| 1327.0 | 0.206 |
| 1326.0 | 0.204 |
| 1325.0 | 0.203 |
| 1324.0 | 0.202 |
| 1323.0 | 0.204 |
| 1322.0 | 0.208 |
| 1321.0 | 0.213 |
| 1320.0 | 0.221 |
| 1319.0 | 0.229 |
| 1318.0 | 0.237 |
| 1317.0 | 0.243 |
| 1316.0 | 0.248 |
| 1315.0 | 0.25 |
| 1314.0 | 0.249 |
| 1313.0 | 0.245 |
| 1312.0 | 0.239 |
| 1311.0 | 0.233 |
| 1310.0 | 0.228 |
| 1309.0 | 0.224 |
| 1308.0 | 0.223 |
| 1307.0 | 0.226 |
| 1306.0 | 0.233 |
| 1305.0 | 0.242 |
| 1304.0 | 0.253 |
| 1303.0 | 0.264 |
| 1302.0 | 0.273 |
| 1301.0 | 0.28 |
| 1300.0 | 0.284 |
| 1299.0 | 0.284 |
| 1298.0 | 0.279 |
| 1297.0 | 0.272 |
| 1296.0 | 0.262 |
| 1295.0 | 0.251 |
| 1294.0 | 0.24 |
| 1293.0 | 0.229 |
| 1292.0 | 0.221 |
| 1291.0 | 0.216 |
| 1290.0 | 0.214 |
| 1289.0 | 0.214 |
| 1288.0 | 0.216 |
| 1287.0 | 0.219 |
| 1286.0 | 0.221 |
| 1285.0 | 0.223 |
| 1284.0 | 0.223 |
| 1283.0 | 0.222 |
| 1282.0 | 0.219 |
| 1281.0 | 0.216 |
| 1280.0 | 0.212 |
| 1279.0 | 0.209 |
| 1278.0 | 0.207 |
| 1277.0 | 0.206 |
| 1276.0 | 0.206 |
| 1275.0 | 0.207 |
| 1274.0 | 0.208 |
| 1273.0 | 0.209 |
| 1272.0 | 0.209 |
| 1271.0 | 0.209 |
| 1270.0 | 0.208 |
| 1269.0 | 0.207 |
| 1268.0 | 0.206 |
| 1267.0 | 0.206 |
| 1266.0 | 0.206 |
| 1265.0 | 0.207 |
| 1264.0 | 0.209 |
| 1263.0 | 0.21 |
| 1262.0 | 0.211 |
| 1261.0 | 0.212 |
| 1260.0 | 0.211 |
| 1259.0 | 0.21 |
| 1258.0 | 0.21 |
| 1257.0 | 0.209 |
| 1256.0 | 0.21 |
| 1255.0 | 0.212 |
| 1254.0 | 0.217 |
| 1253.0 | 0.224 |
| 1252.0 | 0.232 |
| 1251.0 | 0.241 |
| 1250.0 | 0.249 |
| 1249.0 | 0.256 |
| 1248.0 | 0.26 |
| 1247.0 | 0.261 |
| 1246.0 | 0.258 |
| 1245.0 | 0.253 |
| 1244.0 | 0.247 |
| 1243.0 | 0.241 |
| 1242.0 | 0.236 |
| 1241.0 | 0.235 |
| 1240.0 | 0.238 |
| 1239.0 | 0.245 |
| 1238.0 | 0.255 |
| 1237.0 | 0.267 |
| 1236.0 | 0.278 |
| 1235.0 | 0.286 |
| 1234.0 | 0.291 |
| 1233.0 | 0.291 |
| 1232.0 | 0.286 |
| 1231.0 | 0.278 |
| 1230.0 | 0.268 |
| 1229.0 | 0.258 |
| 1228.0 | 0.249 |
| 1227.0 | 0.244 |
| 1226.0 | 0.242 |
| 1225.0 | 0.245 |
| 1224.0 | 0.249 |
| 1223.0 | 0.255 |
| 1222.0 | 0.26 |
| 1221.0 | 0.263 |
| 1220.0 | 0.263 |
| 1219.0 | 0.261 |
| 1218.0 | 0.255 |
| 1217.0 | 0.249 |
| 1216.0 | 0.241 |
| 1215.0 | 0.234 |
| 1214.0 | 0.228 |
| 1213.0 | 0.224 |
| 1212.0 | 0.221 |
| 1211.0 | 0.219 |
| 1210.0 | 0.217 |
| 1209.0 | 0.214 |
| 1208.0 | 0.211 |
| 1207.0 | 0.207 |
| 1206.0 | 0.204 |
| 1205.0 | 0.202 |
| 1204.0 | 0.203 |
| 1203.0 | 0.208 |
| 1202.0 | 0.215 |
| 1201.0 | 0.224 |
| 1200.0 | 0.233 |
| 1199.0 | 0.241 |
| 1198.0 | 0.245 |
| 1197.0 | 0.245 |
| 1196.0 | 0.24 |
| 1195.0 | 0.231 |
| 1194.0 | 0.221 |
| 1193.0 | 0.213 |
| 1192.0 | 0.209 |
| 1191.0 | 0.211 |
| 1190.0 | 0.22 |
| 1189.0 | 0.234 |
| 1188.0 | 0.251 |
| 1187.0 | 0.268 |
| 1186.0 | 0.282 |
| 1185.0 | 0.291 |
| 1184.0 | 0.296 |
| 1183.0 | 0.296 |
| 1182.0 | 0.292 |
| 1181.0 | 0.287 |
| 1180.0 | 0.284 |
| 1179.0 | 0.282 |
| 1178.0 | 0.283 |
| 1177.0 | 0.287 |
| 1176.0 | 0.292 |
| 1175.0 | 0.296 |
| 1174.0 | 0.298 |
| 1173.0 | 0.295 |
| 1172.0 | 0.289 |
| 1171.0 | 0.278 |
| 1170.0 | 0.266 |
| 1169.0 | 0.253 |
| 1168.0 | 0.242 |
| 1167.0 | 0.236 |
| 1166.0 | 0.233 |
| 1165.0 | 0.235 |
| 1164.0 | 0.238 |
| 1163.0 | 0.24 |
| 1162.0 | 0.24 |
| 1161.0 | 0.236 |
| 1160.0 | 0.228 |
| 1159.0 | 0.217 |
| 1158.0 | 0.206 |
| 1157.0 | 0.198 |
| 1156.0 | 0.192 |
| 1155.0 | 0.191 |
| 1154.0 | 0.193 |
| 1153.0 | 0.197 |
| 1152.0 | 0.199 |
| 1151.0 | 0.199 |
| 1150.0 | 0.198 |
| 1149.0 | 0.196 |
| 1148.0 | 0.198 |
| 1147.0 | 0.207 |
| 1146.0 | 0.222 |
| 1145.0 | 0.245 |
| 1144.0 | 0.272 |
| 1143.0 | 0.299 |
| 1142.0 | 0.321 |
| 1141.0 | 0.336 |
| 1140.0 | 0.342 |
| 1139.0 | 0.338 |
| 1138.0 | 0.327 |
| 1137.0 | 0.312 |
| 1136.0 | 0.297 |
| 1135.0 | 0.288 |
| 1134.0 | 0.287 |
| 1133.0 | 0.295 |
| 1132.0 | 0.308 |
| 1131.0 | 0.324 |
| 1130.0 | 0.338 |
| 1129.0 | 0.348 |
| 1128.0 | 0.353 |
| 1127.0 | 0.354 |
| 1126.0 | 0.354 |
| 1125.0 | 0.356 |
| 1124.0 | 0.364 |
| 1123.0 | 0.377 |
| 1122.0 | 0.394 |
| 1121.0 | 0.411 |
| 1120.0 | 0.422 |
| 1119.0 | 0.423 |
| 1118.0 | 0.412 |
| 1117.0 | 0.387 |
| 1116.0 | 0.354 |
| 1115.0 | 0.321 |
| 1114.0 | 0.296 |
| 1113.0 | 0.288 |
| 1112.0 | 0.298 |
| 1111.0 | 0.324 |
| 1110.0 | 0.355 |
| 1109.0 | 0.38 |
| 1108.0 | 0.392 |
| 1107.0 | 0.386 |
| 1106.0 | 0.361 |
| 1105.0 | 0.32 |
| 1104.0 | 0.271 |
| 1103.0 | 0.228 |
| 1102.0 | 0.2 |
| 1101.0 | 0.192 |
| 1100.0 | 0.203 |
| 1099.0 | 0.226 |
| 1098.0 | 0.248 |
| 1097.0 | 0.262 |
| 1096.0 | 0.261 |
| 1095.0 | 0.246 |
| 1094.0 | 0.222 |
| 1093.0 | 0.196 |
| 1092.0 | 0.176 |
| 1091.0 | 0.17 |
| 1090.0 | 0.18 |
| 1089.0 | 0.2 |
| 1088.0 | 0.221 |
| 1087.0 | 0.235 |
| 1086.0 | 0.237 |
| 1085.0 | 0.227 |
| 1084.0 | 0.208 |
| 1083.0 | 0.191 |
| 1082.0 | 0.184 |
| 1081.0 | 0.193 |
| 1080.0 | 0.218 |
| 1079.0 | 0.251 |
| 1078.0 | 0.282 |
| 1077.0 | 0.303 |
| 1076.0 | 0.311 |
| 1075.0 | 0.305 |
| 1074.0 | 0.291 |
| 1073.0 | 0.278 |
| 1072.0 | 0.271 |
| 1071.0 | 0.274 |
| 1070.0 | 0.286 |
| 1069.0 | 0.301 |
| 1068.0 | 0.313 |
| 1067.0 | 0.315 |
| 1066.0 | 0.306 |
| 1065.0 | 0.286 |
| 1064.0 | 0.264 |
| 1063.0 | 0.243 |
| 1062.0 | 0.23 |
| 1061.0 | 0.224 |
| 1060.0 | 0.225 |
| 1059.0 | 0.225 |
| 1058.0 | 0.221 |
| 1057.0 | 0.21 |
| 1056.0 | 0.196 |
| 1055.0 | 0.182 |
| 1054.0 | 0.176 |
| 1053.0 | 0.18 |
| 1052.0 | 0.194 |
| 1051.0 | 0.214 |
| 1050.0 | 0.231 |
| 1049.0 | 0.236 |
| 1048.0 | 0.23 |
| 1047.0 | 0.215 |
| 1046.0 | 0.199 |
| 1045.0 | 0.195 |
| 1044.0 | 0.209 |
| 1043.0 | 0.24 |
| 1042.0 | 0.279 |
| 1041.0 | 0.314 |
| 1040.0 | 0.336 |
| 1039.0 | 0.337 |
| 1038.0 | 0.322 |
| 1037.0 | 0.301 |
| 1036.0 | 0.29 |
| 1035.0 | 0.298 |
| 1034.0 | 0.328 |
| 1033.0 | 0.372 |
| 1032.0 | 0.413 |
| 1031.0 | 0.441 |
| 1030.0 | 0.446 |
| 1029.0 | 0.43 |
| 1028.0 | 0.399 |
| 1027.0 | 0.368 |
| 1026.0 | 0.349 |
| 1025.0 | 0.353 |
| 1024.0 | 0.374 |
| 1023.0 | 0.404 |
| 1022.0 | 0.427 |
| 1021.0 | 0.434 |
| 1020.0 | 0.417 |
| 1019.0 | 0.383 |
| 1018.0 | 0.341 |
| 1017.0 | 0.303 |
| 1016.0 | 0.28 |
| 1015.0 | 0.276 |
| 1014.0 | 0.284 |
| 1013.0 | 0.294 |
| 1012.0 | 0.293 |
| 1011.0 | 0.277 |
| 1010.0 | 0.25 |
| 1009.0 | 0.221 |
| 1008.0 | 0.2 |
| 1007.0 | 0.198 |
| 1006.0 | 0.21 |
| 1005.0 | 0.228 |
| 1004.0 | 0.239 |
| 1003.0 | 0.233 |
| 1002.0 | 0.211 |
| 1001.0 | 0.186 |
| 1000.0 | 0.177 |
| 999.0 | 0.19 |
| 998.0 | 0.227 |
| 997.0 | 0.276 |
| 996.0 | 0.316 |
| 995.0 | 0.341 |
| 994.0 | 0.348 |
| 993.0 | 0.347 |
| 992.0 | 0.352 |
| 991.0 | 0.375 |
| 990.0 | 0.417 |
| 989.0 | 0.471 |
| 988.0 | 0.526 |
| 987.0 | 0.566 |
| 986.0 | 0.583 |
| 985.0 | 0.581 |
| 984.0 | 0.566 |
| 983.0 | 0.546 |
| 982.0 | 0.531 |
| 981.0 | 0.524 |
| 980.0 | 0.528 |
| 979.0 | 0.536 |
| 978.0 | 0.544 |
| 977.0 | 0.549 |
| 976.0 | 0.551 |
| 975.0 | 0.548 |
| 974.0 | 0.545 |
| 973.0 | 0.54 |
| 972.0 | 0.534 |
| 971.0 | 0.522 |
| 970.0 | 0.504 |
| 969.0 | 0.48 |
| 968.0 | 0.456 |
| 967.0 | 0.435 |
| 966.0 | 0.422 |
| 965.0 | 0.416 |
| 964.0 | 0.414 |
| 963.0 | 0.407 |
| 962.0 | 0.387 |
| 961.0 | 0.352 |
| 960.0 | 0.306 |
| 959.0 | 0.259 |
| 958.0 | 0.217 |
| 957.0 | 0.186 |
| 956.0 | 0.169 |
| 955.0 | 0.158 |
| 954.0 | 0.147 |
| 953.0 | 0.132 |
| 952.0 | 0.115 |
| 951.0 | 0.099 |
| 950.0 | 0.086 |
| 949.0 | 0.078 |
| 948.0 | 0.072 |
| 947.0 | 0.069 |
| 946.0 | 0.07 |
| 945.0 | 0.078 |
| 944.0 | 0.095 |
| 943.0 | 0.12 |
| 942.0 | 0.146 |
| 941.0 | 0.168 |
| 940.0 | 0.179 |
| 939.0 | 0.177 |
| 938.0 | 0.164 |
| 937.0 | 0.146 |
| 936.0 | 0.132 |
| 935.0 | 0.124 |
| 934.0 | 0.123 |
| 933.0 | 0.126 |
| 932.0 | 0.128 |
| 931.0 | 0.128 |
| 930.0 | 0.125 |
| 929.0 | 0.119 |
| 928.0 | 0.113 |
| 927.0 | 0.108 |
| 926.0 | 0.103 |
| 925.0 | 0.097 |
| 924.0 | 0.091 |
| 923.0 | 0.085 |
| 922.0 | 0.079 |
| 921.0 | 0.074 |
| 920.0 | 0.07 |
| 919.0 | 0.068 |
| 918.0 | 0.068 |
| 917.0 | 0.07 |
| 916.0 | 0.075 |
| 915.0 | 0.082 |
| 914.0 | 0.088 |
| 913.0 | 0.091 |
| 912.0 | 0.091 |
| 911.0 | 0.09 |
| 910.0 | 0.088 |
| 909.0 | 0.089 |
| 908.0 | 0.092 |
| 907.0 | 0.097 |
| 906.0 | 0.099 |
| 905.0 | 0.098 |
| 904.0 | 0.096 |
| 903.0 | 0.091 |
| 902.0 | 0.088 |
| 901.0 | 0.085 |
| 900.0 | 0.083 |
| 899.0 | 0.081 |
| 898.0 | 0.077 |
| 897.0 | 0.072 |
| 896.0 | 0.067 |
| 895.0 | 0.063 |
| 894.0 | 0.058 |
| 893.0 | 0.055 |
| 892.0 | 0.051 |
| 891.0 | 0.047 |
| 890.0 | 0.042 |
| 889.0 | 0.039 |
| 888.0 | 0.036 |
| 887.0 | 0.035 |
| 886.0 | 0.035 |
| 885.0 | 0.036 |
| 884.0 | 0.037 |
| 883.0 | 0.04 |
| 882.0 | 0.042 |
| 881.0 | 0.045 |
| 880.0 | 0.047 |
| 879.0 | 0.049 |
| 878.0 | 0.051 |
| 877.0 | 0.054 |
| 876.0 | 0.056 |
| 875.0 | 0.057 |
| 874.0 | 0.058 |
| 873.0 | 0.058 |
| 872.0 | 0.057 |
| 871.0 | 0.056 |
| 870.0 | 0.055 |
| 869.0 | 0.053 |
| 868.0 | 0.05 |
| 867.0 | 0.046 |
| 866.0 | 0.042 |
| 865.0 | 0.038 |
| 864.0 | 0.033 |
| 863.0 | 0.03 |
| 862.0 | 0.027 |
| 861.0 | 0.024 |
| 860.0 | 0.023 |
| 859.0 | 0.021 |
| 858.0 | 0.019 |
| 857.0 | 0.02 |
| 856.0 | 0.024 |
| 855.0 | 0.029 |
| 854.0 | 0.029 |
| 853.0 | 0.026 |
| 852.0 | 0.021 |
| 851.0 | 0.019 |
| 850.0 | 0.019 |
| 849.0 | 0.019 |
| 848.0 | 0.017 |
| 847.0 | 0.015 |
| 846.0 | 0.014 |
| 845.0 | 0.016 |
| 844.0 | 0.02 |
| 843.0 | 0.021 |
| 842.0 | 0.017 |
| 841.0 | 0.013 |
| 840.0 | 0.011 |
| 839.0 | 0.013 |
| 838.0 | 0.016 |
| 837.0 | 0.017 |
| 836.0 | 0.014 |
| 835.0 | 0.01 |
| 834.0 | 0.009 |
| 833.0 | 0.011 |
| 832.0 | 0.015 |
| 831.0 | 0.015 |
| 830.0 | 0.011 |
| 829.0 | 0.007 |
| 828.0 | 0.007 |
| 827.0 | 0.01 |
| 826.0 | 0.012 |
| 825.0 | 0.01 |
| 824.0 | 0.007 |
| 823.0 | 0.006 |
| 822.0 | 0.009 |
| 821.0 | 0.013 |
| 820.0 | 0.014 |
| 819.0 | 0.01 |
| 818.0 | 0.006 |
| 817.0 | 0.006 |
| 816.0 | 0.009 |
| 815.0 | 0.011 |
| 814.0 | 0.01 |
| 813.0 | 0.007 |
| 812.0 | 0.005 |
| 811.0 | 0.005 |
| 810.0 | 0.006 |
| 809.0 | 0.006 |
| 808.0 | 0.005 |
| 807.0 | 0.003 |
| 806.0 | 0.004 |
| 805.0 | 0.005 |
| 804.0 | 0.005 |
| 803.0 | 0.004 |
| 802.0 | 0.003 |
| 801.0 | 0.005 |
| 800.0 | 0.007 |
| 799.0 | 0.007 |
| 798.0 | 0.005 |
| 797.0 | 0.004 |
| 796.0 | 0.009 |
| 795.0 | 0.014 |
| 794.0 | 0.015 |
| 793.0 | 0.011 |
| 792.0 | 0.006 |
| 791.0 | 0.006 |
| 790.0 | 0.01 |
| 789.0 | 0.014 |
| 788.0 | 0.012 |
| 787.0 | 0.007 |
| 786.0 | 0.005 |
| 785.0 | 0.008 |
| 784.0 | 0.012 |
| 783.0 | 0.011 |
| 782.0 | 0.007 |
| 781.0 | 0.004 |
| 780.0 | 0.005 |
| 779.0 | 0.007 |
| 778.0 | 0.007 |
| 777.0 | 0.005 |
| 776.0 | 0.004 |
| 775.0 | 0.007 |
| 774.0 | 0.009 |
| 773.0 | 0.009 |
| 772.0 | 0.006 |
| 771.0 | 0.005 |
| 770.0 | 0.007 |
| 769.0 | 0.009 |
| 768.0 | 0.008 |
| 767.0 | 0.005 |
| 766.0 | 0.005 |
| 765.0 | 0.007 |
| 764.0 | 0.008 |
| 763.0 | 0.007 |
| 762.0 | 0.004 |
| 761.0 | 0.004 |
| 760.0 | 0.006 |
| 759.0 | 0.007 |
| 758.0 | 0.006 |
| 757.0 | 0.004 |
| 756.0 | 0.004 |
| 755.0 | 0.005 |
| 754.0 | 0.006 |
| 753.0 | 0.005 |
| 752.0 | 0.003 |
| 751.0 | 0.003 |
| 750.0 | 0.003 |
| 749.0 | 0.003 |
| 748.0 | 0.003 |
| 747.0 | 0.002 |
| 746.0 | 0.002 |
| 745.0 | 0.003 |
| 744.0 | 0.003 |
| 743.0 | 0.002 |
| 742.0 | 0.002 |
| 741.0 | 0.002 |
| 740.0 | 0.003 |
| 739.0 | 0.002 |
| 738.0 | 0.002 |
| 737.0 | 0.003 |
| 736.0 | 0.002 |
| 735.0 | 0.002 |
| 734.0 | 0.001 |
| 733.0 | 0.006 |
| 732.0 | 0.004 |
| 731.0 | 0.003 |
| 730.0 | 0.006 |
| 729.0 | 0.001 |
| 728.0 | 0.002 |
| 727.0 | 0 |
| 726.0 | 0.009 |
| 725.0 | 0.007 |
| 724.0 | 0.006 |
| 723.0 | 0.006 |
| 722.0 | 0.006 |
| 721.0 | 0.005 |
| 720.0 | 0.005 |
| 719.0 | 0.002 |
| 718.0 | 0.006 |
| 717.0 | 0.003 |
| 716.0 | 0.002 |
| 715.0 | 0.004 |
| 714.0 | 0.008 |
| 713.0 | 0.006 |
| 712.0 | 0.005 |
| 711.0 | 0.007 |
| 710.0 | 0.001 |
| 709.0 | 0.004 |
| 708.0 | 0.005 |
| 707.0 | 0.002 |
| 706.0 | 0.005 |
| 705.0 | 0.006 |
| 704.0 | 0.003 |
| 703.0 | 0.001 |
| 702.0 | 0.007 |
| 701.0 | 0.007 |
| 700.0 | 0.001 |
| 699.0 | 0.001 |
| 698.0 | 0.003 |
| 697.0 | 0.005 |
| 696.0 | 0.003 |
| 695.0 | 0.004 |
| 694.0 | 0.005 |
| 693.0 | 0.005 |
| 692.0 | 0.004 |
| 691.0 | 0.005 |
| 690.0 | 0.004 |
| 689.0 | 0.005 |
| 688.0 | 0.006 |
| 687.0 | 0.003 |
| 686.0 | 0.003 |
| 685.0 | 0.004 |
| 684.0 | 0.004 |
| 683.0 | 0.003 |
| 682.0 | 0.004 |
| 681.0 | 0.002 |
| 680.0 | 0.001 |
| 679.0 | 0.004 |
| 678.0 | 0.004 |
| 677.0 | 0.004 |
| 676.0 | 0.003 |
| 675.0 | 0.003 |
| 674.0 | 0.005 |
| 673.0 | 0.005 |
| 672.0 | 0.003 |
| 671.0 | 0.002 |
| 670.0 | 0.004 |
| 669.0 | 0.006 |
| 668.0 | 0.006 |
| 667.0 | 0.002 |
| 666.0 | 0.001 |
| 665.0 | 0.002 |
| 664.0 | 0.002 |
| 663.0 | 0.001 |
| 662.0 | 0.003 |
| 661.0 | 0.003 |
| 660.0 | 0.003 |
| 659.0 | 0.004 |
| 658.0 | 0.003 |
| 657.0 | 0 |
| 656.0 | 0.002 |
| 655.0 | 0.006 |
| 654.0 | 0.003 |
| 653.0 | 0.003 |
| 652.0 | 0.005 |
| 651.0 | 0.006 |
| 650.0 | 0.005 |
| 649.0 | 0.004 |
| 648.0 | 0.002 |
| 647.0 | 0.001 |
| 646.0 | 0.001 |
| 645.0 | 0.003 |
| 644.0 | 0.006 |
| 643.0 | 0.008 |
| 642.0 | 0.007 |
| 641.0 | 0.007 |
| 640.0 | 0.006 |
| 639.0 | 0.003 |
| 638.0 | 0.004 |
| 637.0 | 0.004 |
| 636.0 | 0.006 |
| 635.0 | 0.005 |
| 634.0 | 0.004 |
| 633.0 | 0.004 |
| 632.0 | 0.005 |
| 631.0 | 0.005 |
| 630.0 | 0.007 |
| 629.0 | 0.006 |
| 628.0 | 0.005 |
| 627.0 | 0.007 |
| 626.0 | 0.007 |
| 625.0 | 0.006 |
| 624.0 | 0.007 |
| 623.0 | 0.006 |
| 622.0 | 0.004 |
| 621.0 | 0.004 |
| 620.0 | 0.006 |
| 619.0 | 0.006 |
| 618.0 | 0.006 |
| 617.0 | 0.005 |
| 616.0 | 0.007 |
| 615.0 | 0.007 |
| 614.0 | 0.005 |
| 613.0 | 0.005 |
| 612.0 | 0.005 |
| 611.0 | 0.005 |
| 610.0 | 0.008 |
| 609.0 | 0.006 |
| 608.0 | 0.005 |
| 607.0 | 0.007 |
| 606.0 | 0.007 |
| 605.0 | 0.006 |
| 604.0 | 0.008 |
| 603.0 | 0.009 |
| 602.0 | 0.011 |
| 601.0 | 0.008 |
| 600.0 | 0.006 |
| 599.0 | 0.008 |
| 598.0 | 0.008 |
| 597.0 | 0.007 |
| 596.0 | 0.009 |
| 595.0 | 0.005 |
| 594.0 | 0.006 |
| 593.0 | 0.007 |
| 592.0 | 0.007 |
| 591.0 | 0.005 |
| 590.0 | 0.007 |
| 589.0 | 0.009 |
| 588.0 | 0.009 |
| 587.0 | 0.009 |
| 586.0 | 0.011 |
| 585.0 | 0.008 |
| 584.0 | 0.009 |
| 583.0 | 0.009 |
| 582.0 | 0.013 |
| 581.0 | 0.014 |
| 580.0 | 0.01 |
| 579.0 | 0.012 |
| 578.0 | 0.014 |
| 577.0 | 0.014 |
| 576.0 | 0.016 |
| 575.0 | 0.021 |
| 574.0 | 0.023 |
| 573.0 | 0.21 |
| 572.0 | 0.388 |
| 571.0 | 0.768 |
| 570.0 | 3.919 |
| 569.0 | 5.071 |
| 568.0 | 5.535 |
| 567.0 | 5.611 |
| 566.0 | 5.827 |
| 565.0 | 6.222 |
| 564.0 | 6.086 |
| 563.0 | 5.793 |
| 562.0 | 5.971 |
| 561.0 | 6.121 |
| 560.0 | 5.569 |
| 559.0 | 4.266 |
| 558.0 | 3.138 |
| 557.0 | 0.821 |
| 556.0 | 0.282 |
| 555.0 | 0.085 |
| 554.0 | 0.036 |
| 553.0 | 0.023 |
| 552.0 | 0.02 |
| 551.0 | 0.016 |
| 550.0 | 0.01 |
| 549.0 | 0.013 |
| 548.0 | 0.013 |
| 547.0 | 0.016 |
| 546.0 | 0.015 |
| 545.0 | 0.01 |
| 544.0 | 0.008 |
| 543.0 | 0.01 |
| 542.0 | 0.011 |
| 541.0 | 0.012 |
| 540.0 | 0.011 |
| 539.0 | 0.009 |
| 538.0 | 0.007 |
| 537.0 | 0.008 |
| 536.0 | 0.009 |
| 535.0 | 0.01 |
| 534.0 | 0.01 |
| 533.0 | 0.009 |
| 532.0 | 0.007 |
| 531.0 | 0.007 |
| 530.0 | 0.01 |
| 529.0 | 0.012 |
| 528.0 | 0.01 |
| 527.0 | 0.007 |
| 526.0 | 0.005 |
| 525.0 | 0.007 |
| 524.0 | 0.01 |
| 523.0 | 0.012 |
| 522.0 | 0.011 |
| 521.0 | 0.007 |
| 520.0 | 0.005 |
| 519.0 | 0.009 |
| 518.0 | 0.011 |
| 517.0 | 0.011 |
| 516.0 | 0.009 |
| 515.0 | 0.009 |
| 514.0 | 0.007 |
| 513.0 | 0.008 |
| 512.0 | 0.01 |
| 511.0 | 0.012 |
| 510.0 | 0.009 |
| 509.0 | 0.005 |
| 508.0 | 0.003 |
| 507.0 | 0.005 |
| 506.0 | 0.008 |
| 505.0 | 0.01 |
| 504.0 | 0.009 |
| 503.0 | 0.005 |
| 502.0 | 0.003 |
| 501.0 | 0.008 |
| 500.0 | 0.009 |
| 499.0 | 0.011 |
| 498.0 | 0.009 |
| 497.0 | 0.004 |
| 496.0 | 0.007 |
| 495.0 | 0.01 |
| 494.0 | 0.011 |
| 493.0 | 0.015 |
| 492.0 | 0.011 |
| 491.0 | 0.008 |
| 490.0 | 0.007 |
| 489.0 | 0.011 |
| 488.0 | 0.012 |
| 487.0 | 0.011 |
| 486.0 | 0.012 |
| 485.0 | 0.007 |
| 484.0 | 0.005 |
| 483.0 | 0.01 |
| 482.0 | 0.011 |
| 481.0 | 0.011 |
| 480.0 | 0.01 |
| 479.0 | 0.006 |
| 478.0 | 0.004 |
| 477.0 | 0.01 |
| 476.0 | 0.011 |
| 475.0 | 0.011 |
| 474.0 | 0.012 |
| 473.0 | 0.009 |
| 472.0 | 0.008 |
| 471.0 | 0.014 |
| 470.0 | 0.013 |
| 469.0 | 0.013 |
| 468.0 | 0.012 |
| 467.0 | 0.009 |
| 466.0 | 0.006 |
| 465.0 | 0.01 |
| 464.0 | 0.013 |
| 463.0 | 0.014 |
| 462.0 | 0.009 |
| 461.0 | 0.007 |
| 460.0 | 0.006 |
| 459.0 | 0.008 |
| 458.0 | 0.009 |
| 457.0 | 0.012 |
| 456.0 | 0.011 |
| 455.0 | 0.012 |
| 454.0 | 0.011 |
| 453.0 | 0.01 |
| 452.0 | 0.012 |
| 451.0 | 0.015 |
| 450.0 | 0.011 |
| 449.0 | 0.007 |
| 448.0 | 0.008 |
| 447.0 | 0.013 |
| 446.0 | 0.016 |
| 445.0 | 0.017 |
| 444.0 | 0.016 |
| 443.0 | 0.009 |
| 442.0 | 0.01 |
| 441.0 | 0.016 |
| 440.0 | 0.016 |
| 439.0 | 0.017 |
| 438.0 | 0.013 |
| 437.0 | 0.009 |
| 436.0 | 0.013 |
| 435.0 | 0.021 |
| 434.0 | 0.02 |
| 433.0 | 0.02 |
| 432.0 | 0.02 |
| 431.0 | 0.016 |
| 430.0 | 0.016 |
| 429.0 | 0.025 |
| 428.0 | 0.023 |
| 427.0 | 0.025 |
| 426.0 | 0.023 |
| 425.0 | 0.022 |
| 424.0 | 0.023 |
| 423.0 | 0.024 |
| 422.0 | 0.025 |
| 421.0 | 0.026 |
| 420.0 | 0.027 |
| 419.0 | 0.027 |
| 418.0 | 0.029 |
| 417.0 | 0.03 |
| 416.0 | 0.033 |
| 415.0 | 0.035 |
| 414.0 | 0.037 |
| 413.0 | 0.039 |
| 412.0 | 0.042 |
| 411.0 | 0.045 |
| 410.0 | 0.048 |
| 409.0 | 0.051 |
| 408.0 | 0.055 |
| 407.0 | 0.06 |
| 406.0 | 0.067 |
| 405.0 | 0.079 |
| 404.0 | 0.129 |
| 403.0 | 0.275 |
| 402.0 | 0.576 |
| 401.0 | 1.078 |
| 400.0 | 1.818 |
| 399.0 | 2.763 |
| 398.0 | 3.702 |
| 397.0 | 4.565 |
| 396.0 | 4.454 |
| 395.0 | 4.237 |
| 394.0 | 4.565 |
| 393.0 | 4.547 |
| 392.0 | 4.204 |
| 391.0 | 4.643 |
| 390.0 | 4.4 |
| 389.0 | 4.798 |
| 388.0 | 5.04 |
| 387.0 | 4.412 |
| 386.0 | 4.29 |
| 385.0 | 4.6 |
| 384.0 | 4.309 |
| 383.0 | 4.901 |
| 382.0 | 4.901 |
| 381.0 | 4.362 |
| 380.0 | 4.261 |
| 379.0 | 4.619 |
| 378.0 | 4.317 |
| 377.0 | 4.448 |
| 376.0 | 4.286 |
| 375.0 | 4.985 |
| 374.0 | 4.508 |
| 373.0 | 5.337 |
| 372.0 | 5.638 |
| 371.0 | 4.476 |
| 370.0 | 4.248 |
| 369.0 | 4.792 |
| 368.0 | 4.394 |
| 367.0 | 4.761 |
| 366.0 | 4.983 |
| 365.0 | 4.46 |
| 364.0 | 4.303 |
| 363.0 | 4.706 |
| 362.0 | 4.313 |
| 361.0 | 4.76 |
| 360.0 | 4.822 |
| 359.0 | 4.368 |
| 358.0 | 4.264 |
| 357.0 | 4.333 |
| 356.0 | 4.312 |
| 355.0 | 4.555 |
| 354.0 | 5.032 |
| 353.0 | 4.379 |
| 352.0 | 4.301 |
| 351.0 | 4.612 |
| 350.0 | 4.311 |
| 349.0 | 4.788 |
| 348.0 | 5.457 |
| 347.0 | 4.332 |
| 346.0 | 4.32 |
| 345.0 | 4.553 |
| 344.0 | 4.331 |
| 343.0 | 4.535 |
| 342.0 | 4.654 |
| 341.0 | 4.401 |
| 340.0 | 4.319 |
| 339.0 | 4.589 |
| 338.0 | 4.454 |
| 337.0 | 4.653 |
| 336.0 | 4.653 |
| 335.0 | 4.25 |
| 334.0 | 4.351 |
| 333.0 | 4.629 |
| 332.0 | 4.362 |
| 331.0 | 4.651 |
| 330.0 | 4.93 |
| 329.0 | 4.424 |
| 328.0 | 4.338 |
| 327.0 | 4.607 |
| 326.0 | 4.349 |
| 325.0 | 4.41 |
| 324.0 | 4.974 |
| 323.0 | 4.238 |
| 322.0 | 4.326 |
| 321.0 | 4.649 |
| 320.0 | 4.294 |
| 319.0 | 4.672 |
| 318.0 | 4.292 |
| 317.0 | 4.302 |
| 316.0 | 4.234 |
| 315.0 | 4.393 |
| 314.0 | 4.301 |
| 313.0 | 5.225 |
| 312.0 | 5.321 |
| 311.0 | 4.392 |
| 310.0 | 4.242 |
| 309.0 | 5.144 |
| 308.0 | 4.391 |
| 307.0 | 5.622 |
| 306.0 | 4.579 |
| 305.0 | 4.309 |
| 304.0 | 4.353 |
| 303.0 | 4.444 |
| 302.0 | 4.277 |
| 301.0 | 5.921 |
| 300.0 | 5.221 |
| 299.0 | 4.287 |
| 298.0 | 4.266 |
| 297.0 | 4.328 |
| 296.0 | 4.414 |
| 295.0 | 4.965 |
| 294.0 | 5.14 |
| 293.0 | 4.339 |
| 292.0 | 4.21 |
| 291.0 | 4.876 |
| 290.0 | 4.44 |
| 289.0 | 4.963 |
| 288.0 | 5.616 |
| 287.0 | 4.293 |
| 286.0 | 4.336 |
| 285.0 | 4.244 |
| 284.0 | 4.484 |
| 283.0 | 5.012 |
| 282.0 | 5.012 |
| 281.0 | 4.292 |
| 280.0 | 4.324 |
| 279.0 | 4.553 |
| 278.0 | 4.452 |
| 277.0 | 4.659 |
| 276.0 | 4.959 |
| 275.0 | 4.173 |
| 274.0 | 4.369 |
| 273.0 | 4.481 |
| 272.0 | 4.322 |
| 271.0 | 4.709 |
| 270.0 | 5.134 |
| 269.0 | 4.18 |
| 268.0 | 4.172 |
| 267.0 | 4.611 |
| 266.0 | 5.009 |
| 265.0 | 4.912 |
| 264.0 | 5.213 |
| 263.0 | 4.321 |
| 262.0 | 4.204 |
| 261.0 | 4.32 |
| 260.0 | 4.331 |
| 259.0 | 4.735 |
| 258.0 | 4.734 |
| 257.0 | 4.203 |
| 256.0 | 4.256 |
| 255.0 | 4.256 |
| 254.0 | 4.378 |
| 253.0 | 5.607 |
| 252.0 | 4.586 |
| 251.0 | 4.285 |
| 250.0 | 4.144 |
| 249.0 | 4.866 |
| 248.0 | 4.273 |
| 247.0 | 5.128 |
| 246.0 | 4.676 |
| 245.0 | 4.243 |
| 244.0 | 4.165 |
| 243.0 | 4.349 |
| 242.0 | 4.243 |
| 241.0 | 5.127 |
| 240.0 | 4.627 |
| 239.0 | 4.315 |
| 238.0 | 4.189 |
| 237.0 | 4.508 |
| 236.0 | 4.262 |
| 235.0 | 4.864 |
| 234.0 | 4.563 |
| 233.0 | 4.293 |
| 232.0 | 4.12 |
| 231.0 | 4.95 |
| 230.0 | 4.223 |
| 229.0 | 5.602 |
| 228.0 | 4.561 |
| 227.0 | 4.411 |
| 226.0 | 4.268 |
| 225.0 | 4.344 |
| 224.0 | 4.267 |
| 223.0 | 4.996 |
| 222.0 | 4.643 |
| 221.0 | 4.274 |
| 220.0 | 4.141 |
| 219.0 | 4.691 |
| 218.0 | 4.187 |
| 217.0 | 4.718 |
| 216.0 | 4.689 |
| 215.0 | 4.185 |
| 214.0 | 4.144 |
| 213.0 | 4.228 |
| 212.0 | 4.183 |
| 211.0 | 4.588 |
| 210.0 | 4.37 |
| 209.0 | 4.132 |
| 208.0 | 4.154 |
| 207.0 | 4.454 |
| 206.0 | 4.262 |
| 205.0 | 4.407 |
| 204.0 | 4.282 |
| 203.0 | 4.002 |
| 202.0 | 4.024 |
| 201.0 | 4 |
| 200.0 | 3.961 |